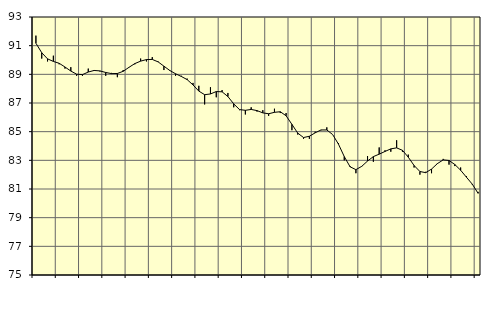
| Category | Piggar | Series 1 |
|---|---|---|
| nan | 91.7 | 91.17 |
| 1.0 | 90.1 | 90.51 |
| 1.0 | 89.9 | 90.08 |
| 1.0 | 90.3 | 89.9 |
| nan | 89.7 | 89.77 |
| 2.0 | 89.4 | 89.51 |
| 2.0 | 89.5 | 89.23 |
| 2.0 | 88.9 | 89.01 |
| nan | 88.9 | 88.98 |
| 3.0 | 89.4 | 89.16 |
| 3.0 | 89.3 | 89.27 |
| 3.0 | 89.2 | 89.24 |
| nan | 88.9 | 89.13 |
| 4.0 | 89.1 | 89.05 |
| 4.0 | 88.8 | 89.06 |
| 4.0 | 89.3 | 89.21 |
| nan | 89.5 | 89.49 |
| 5.0 | 89.7 | 89.75 |
| 5.0 | 90.1 | 89.92 |
| 5.0 | 89.9 | 90.03 |
| nan | 90.2 | 90.04 |
| 6.0 | 89.9 | 89.87 |
| 6.0 | 89.3 | 89.57 |
| 6.0 | 89.3 | 89.27 |
| nan | 88.9 | 89.04 |
| 7.0 | 88.9 | 88.85 |
| 7.0 | 88.7 | 88.63 |
| 7.0 | 88.4 | 88.26 |
| nan | 88.2 | 87.83 |
| 8.0 | 86.9 | 87.58 |
| 8.0 | 88.1 | 87.63 |
| 8.0 | 87.4 | 87.8 |
| nan | 87.9 | 87.78 |
| 9.0 | 87.7 | 87.45 |
| 9.0 | 86.7 | 86.94 |
| 9.0 | 86.5 | 86.54 |
| nan | 86.2 | 86.49 |
| 10.0 | 86.7 | 86.55 |
| 10.0 | 86.4 | 86.47 |
| 10.0 | 86.5 | 86.31 |
| nan | 86.1 | 86.25 |
| 11.0 | 86.6 | 86.35 |
| 11.0 | 86.3 | 86.39 |
| 11.0 | 86.3 | 86.11 |
| nan | 85.1 | 85.51 |
| 12.0 | 84.8 | 84.9 |
| 12.0 | 84.5 | 84.59 |
| 12.0 | 84.5 | 84.68 |
| nan | 85 | 84.92 |
| 13.0 | 85.1 | 85.12 |
| 13.0 | 85.3 | 85.12 |
| 13.0 | 84.8 | 84.8 |
| nan | 84.2 | 84.13 |
| 14.0 | 83 | 83.26 |
| 14.0 | 82.6 | 82.55 |
| 14.0 | 82.1 | 82.35 |
| nan | 82.6 | 82.58 |
| 15.0 | 83.3 | 82.95 |
| 15.0 | 82.9 | 83.26 |
| 15.0 | 83.9 | 83.43 |
| nan | 83.7 | 83.62 |
| 16.0 | 83.6 | 83.8 |
| 16.0 | 84.4 | 83.87 |
| 16.0 | 83.6 | 83.7 |
| nan | 83.4 | 83.22 |
| 17.0 | 82.5 | 82.64 |
| 17.0 | 82 | 82.22 |
| 17.0 | 82.2 | 82.14 |
| nan | 82.1 | 82.39 |
| 18.0 | 82.8 | 82.77 |
| 18.0 | 83.1 | 83.03 |
| 18.0 | 82.7 | 82.99 |
| nan | 82.6 | 82.71 |
| 19.0 | 82.5 | 82.31 |
| 19.0 | 81.9 | 81.82 |
| 19.0 | 81.3 | 81.34 |
| nan | 80.8 | 80.7 |